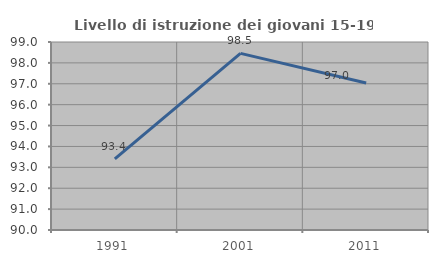
| Category | Livello di istruzione dei giovani 15-19 anni |
|---|---|
| 1991.0 | 93.401 |
| 2001.0 | 98.457 |
| 2011.0 | 97.039 |